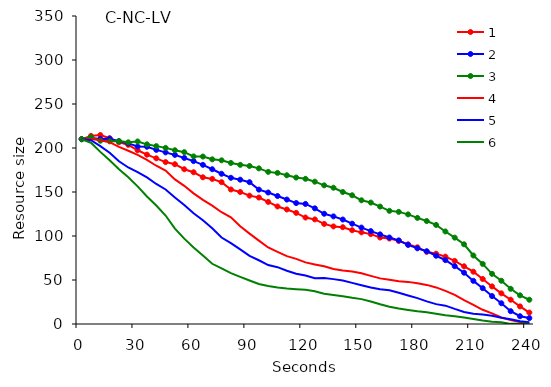
| Category | 1 | 2 | 3 | 4 | 5 | 6 |
|---|---|---|---|---|---|---|
| 0.0 | 210 | 210 | 210 | 210 | 210 | 210 |
| 5.0 | 213.714 | 211.286 | 212.286 | 210.143 | 208.857 | 206 |
| 10.0 | 214.714 | 210.286 | 208.286 | 208.714 | 202.143 | 195.571 |
| 15.0 | 211.143 | 210.571 | 207.571 | 206.571 | 194.571 | 186 |
| 20.0 | 206.571 | 207.714 | 207.857 | 201.286 | 184.857 | 175.857 |
| 25.0 | 203.571 | 205.286 | 206.429 | 196.857 | 177.857 | 166.714 |
| 30.0 | 197.429 | 201.714 | 207.429 | 192.143 | 172.571 | 156.429 |
| 35.0 | 192.429 | 201.429 | 204.143 | 186.429 | 166.571 | 144.857 |
| 40.0 | 188.286 | 197.857 | 202.143 | 179.857 | 159.143 | 134.714 |
| 45.0 | 184 | 195 | 200.143 | 174.286 | 152.857 | 123.286 |
| 50.0 | 181.571 | 192.143 | 197.429 | 164.286 | 143.714 | 108.429 |
| 55.0 | 175.857 | 188.714 | 195.286 | 157 | 135.143 | 97 |
| 60.0 | 172.429 | 185.143 | 190.429 | 148.429 | 125.857 | 87 |
| 65.0 | 166.714 | 180.857 | 190.286 | 141 | 117.857 | 77.714 |
| 70.0 | 164.857 | 175.857 | 187.143 | 134.429 | 108.714 | 68.429 |
| 75.0 | 161.143 | 170.714 | 186 | 127 | 98.286 | 63.143 |
| 80.0 | 152.857 | 166.143 | 183 | 121.286 | 91.857 | 57.714 |
| 85.0 | 150 | 164 | 180.857 | 111.143 | 84.714 | 53.571 |
| 90.0 | 145.857 | 161.143 | 179.571 | 102.714 | 77.429 | 49.429 |
| 95.0 | 143.714 | 152.714 | 176.857 | 94.714 | 72.429 | 45.429 |
| 100.0 | 138.714 | 149.429 | 172.857 | 87 | 67 | 43.286 |
| 105.0 | 133.571 | 145.429 | 171.714 | 82 | 64.571 | 41.571 |
| 110.0 | 130.143 | 141.429 | 169 | 77.143 | 60.571 | 40.429 |
| 115.0 | 126.286 | 137.429 | 166.429 | 74 | 57.143 | 39.571 |
| 120.0 | 121 | 136.429 | 165 | 70 | 55.143 | 38.857 |
| 125.0 | 118.857 | 131.429 | 161.714 | 67.714 | 52 | 37.286 |
| 130.0 | 113.714 | 125.286 | 157.571 | 65.571 | 52.143 | 34.429 |
| 135.0 | 110.857 | 122.286 | 154.857 | 62.429 | 51 | 32.857 |
| 140.0 | 110 | 118.714 | 150 | 60.857 | 49.429 | 31.429 |
| 145.0 | 106.571 | 114 | 146.286 | 59.571 | 46.714 | 29.714 |
| 150.0 | 104.143 | 109.571 | 140.571 | 57.714 | 44.143 | 28.286 |
| 155.0 | 102.143 | 105.571 | 138 | 54.714 | 41.571 | 25.571 |
| 160.0 | 98.286 | 101.857 | 133.429 | 51.857 | 39.429 | 22.429 |
| 165.0 | 97.143 | 98.286 | 128.571 | 50.286 | 38.286 | 19.571 |
| 170.0 | 94.429 | 95 | 127.429 | 48.714 | 35.429 | 17.571 |
| 175.0 | 90.571 | 89.857 | 124.571 | 47.857 | 32.429 | 16 |
| 180.0 | 87.143 | 86 | 120.571 | 46.286 | 29.429 | 14.429 |
| 185.0 | 82 | 82.714 | 117 | 44.429 | 25.714 | 13.286 |
| 190.0 | 79.857 | 77.571 | 112.571 | 41.571 | 22.571 | 11.714 |
| 195.0 | 76.571 | 72.571 | 105.143 | 37.714 | 20.857 | 9.857 |
| 200.0 | 71.714 | 65.714 | 98.143 | 33.143 | 17.143 | 8.714 |
| 205.0 | 65.571 | 58.286 | 90.571 | 27.143 | 13.714 | 7.429 |
| 210.0 | 59.429 | 49 | 77.857 | 21.857 | 11.571 | 5.571 |
| 215.0 | 51.143 | 40.714 | 68.286 | 16.143 | 10.714 | 3.857 |
| 220.0 | 42.714 | 31.714 | 57 | 12.143 | 9.286 | 2.429 |
| 225.0 | 34.857 | 23.571 | 49.143 | 7.429 | 7.143 | 1.857 |
| 230.0 | 27.571 | 14.571 | 40 | 4.429 | 5.286 | 0.143 |
| 235.0 | 20 | 8.857 | 32.571 | 2.286 | 3.143 | 0.143 |
| 240.0 | 13 | 6.714 | 27.571 | 1 | 1.857 | 0.143 |